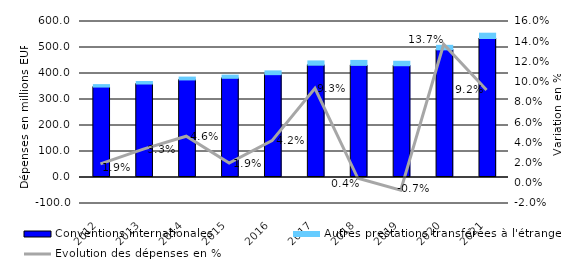
| Category | Conventions internationales | Autres prestations transférées à l'étranger |
|---|---|---|
| 2012.0 | 347.809 | 9.486 |
| 2013.0 | 359.547 | 9.632 |
| 2014.0 | 375.228 | 10.945 |
| 2015.0 | 381.524 | 12.156 |
| 2016.0 | 395.549 | 14.54 |
| 2017.0 | 431.883 | 16.51 |
| 2018.0 | 431.189 | 19.195 |
| 2019.0 | 429.887 | 17.209 |
| 2020.0 | 491.033 | 17.296 |
| 2021.0 | 534.592 | 20.402 |